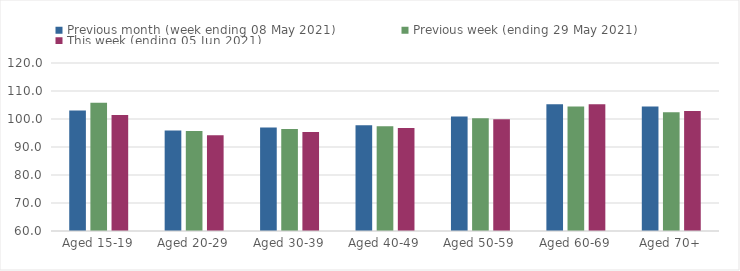
| Category | Previous month (week ending 08 May 2021) | Previous week (ending 29 May 2021) | This week (ending 05 Jun 2021) |
|---|---|---|---|
| Aged 15-19 | 103.01 | 105.82 | 101.47 |
| Aged 20-29 | 95.89 | 95.68 | 94.21 |
| Aged 30-39 | 96.96 | 96.42 | 95.38 |
| Aged 40-49 | 97.77 | 97.43 | 96.8 |
| Aged 50-59 | 100.89 | 100.26 | 99.94 |
| Aged 60-69 | 105.26 | 104.42 | 105.23 |
| Aged 70+ | 104.47 | 102.43 | 102.9 |